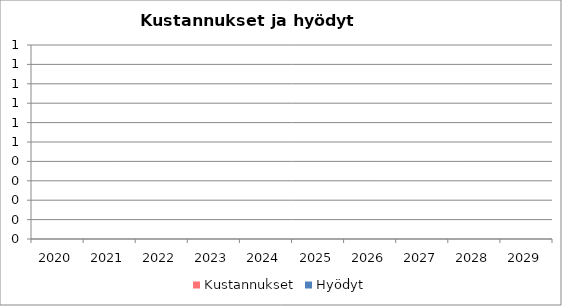
| Category | Kustannukset | Hyödyt |
|---|---|---|
| 2020 | 0 | 0 |
| 2021 | 0 | 0 |
| 2022 | 0 | 0 |
| 2023 | 0 | 0 |
| 2024 | 0 | 0 |
| 2025 | 0 | 0 |
| 2026 | 0 | 0 |
| 2027 | 0 | 0 |
| 2028 | 0 | 0 |
| 2029 | 0 | 0 |